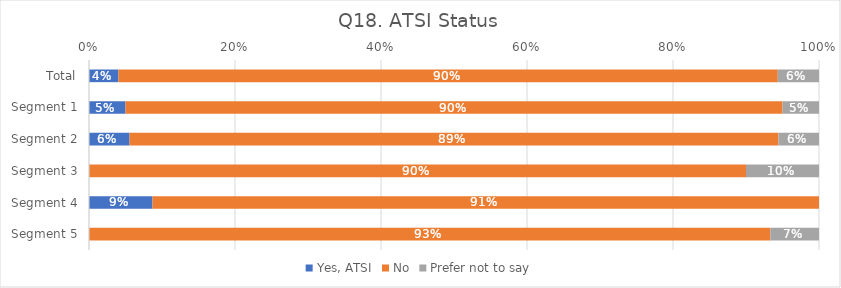
| Category | Yes, ATSI | No | Prefer not to say |
|---|---|---|---|
| Total | 0.04 | 0.903 | 0.056 |
| Segment 1 | 0.05 | 0.9 | 0.05 |
| Segment 2 | 0.056 | 0.889 | 0.056 |
| Segment 3 | 0 | 0.9 | 0.1 |
| Segment 4 | 0.087 | 0.913 | 0 |
| Segment 5 | 0 | 0.933 | 0.067 |